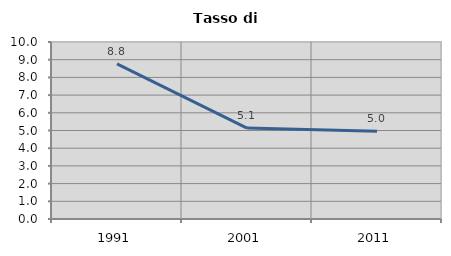
| Category | Tasso di disoccupazione   |
|---|---|
| 1991.0 | 8.763 |
| 2001.0 | 5.14 |
| 2011.0 | 4.962 |